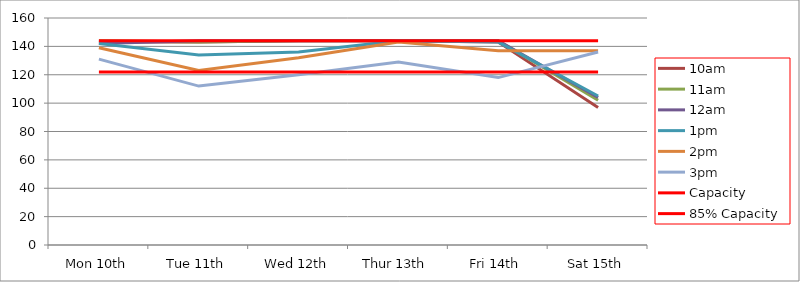
| Category | 9am | 10am | 11am | 12am | 1pm | 2pm | 3pm | 4pm | 5pm | Capacity | 85% Capacity |
|---|---|---|---|---|---|---|---|---|---|---|---|
| Mon 10th |  | 143 | 144 | 142 | 142 | 139 | 131 |  |  | 144 | 122 |
| Tue 11th |  | 143 | 143 | 144 | 134 | 123 | 112 |  |  | 144 | 122 |
| Wed 12th |  | 144 | 144 | 144 | 136 | 132 | 120 |  |  | 144 | 122 |
| Thur 13th |  | 144 | 144 | 144 | 144 | 143 | 129 |  |  | 144 | 122 |
| Fri 14th |  | 143 | 144 | 144 | 143 | 137 | 118 |  |  | 144 | 122 |
| Sat 15th |  | 97 | 102 | 104 | 105 | 137 | 136 |  |  | 144 | 122 |